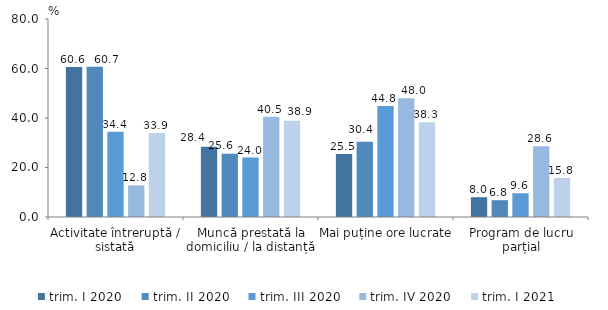
| Category | trim. I 2020 | trim. II 2020 | trim. III 2020 | trim. IV 2020 | trim. I 2021 |
|---|---|---|---|---|---|
| Activitate întreruptă / sistată | 60.6 | 60.7 | 34.4 | 12.8 | 33.9 |
| Muncă prestată la domiciliu / la distanță | 28.4 | 25.6 | 24 | 40.5 | 38.9 |
| Mai puține ore lucrate  | 25.5 | 30.4 | 44.8 | 48 | 38.3 |
| Program de lucru parțial | 8 | 6.8 | 9.6 | 28.6 | 15.8 |